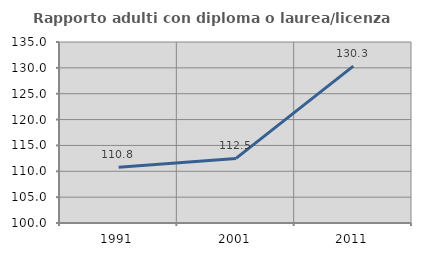
| Category | Rapporto adulti con diploma o laurea/licenza media  |
|---|---|
| 1991.0 | 110.764 |
| 2001.0 | 112.488 |
| 2011.0 | 130.347 |